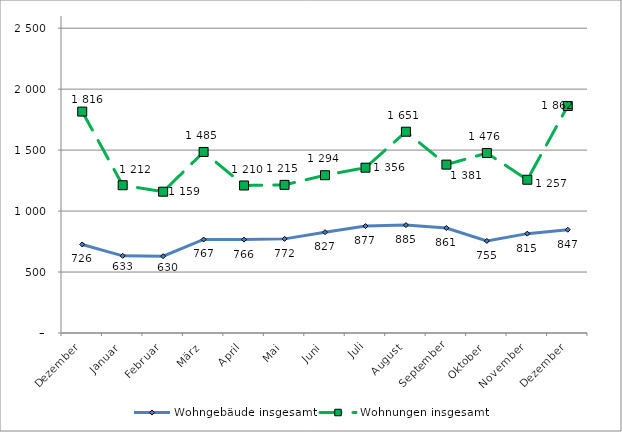
| Category | Wohngebäude insgesamt | Wohnungen insgesamt |
|---|---|---|
| Dezember | 726 | 1816 |
| Januar | 633 | 1212 |
| Februar | 630 | 1159 |
| März | 767 | 1485 |
| April | 766 | 1210 |
| Mai | 772 | 1215 |
| Juni | 827 | 1294 |
| Juli | 877 | 1356 |
| August | 885 | 1651 |
| September | 861 | 1381 |
| Oktober | 755 | 1476 |
| November | 815 | 1257 |
| Dezember | 847 | 1862 |